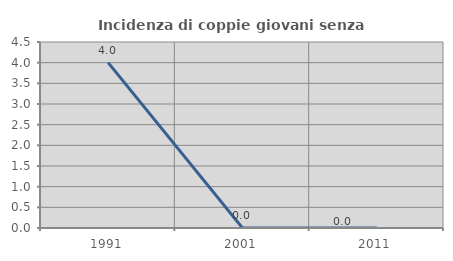
| Category | Incidenza di coppie giovani senza figli |
|---|---|
| 1991.0 | 4 |
| 2001.0 | 0 |
| 2011.0 | 0 |